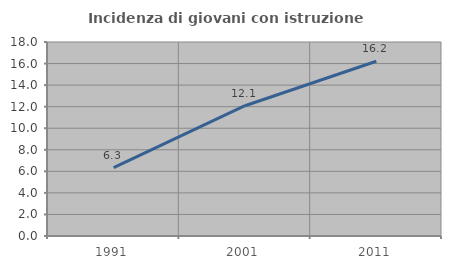
| Category | Incidenza di giovani con istruzione universitaria |
|---|---|
| 1991.0 | 6.349 |
| 2001.0 | 12.088 |
| 2011.0 | 16.216 |